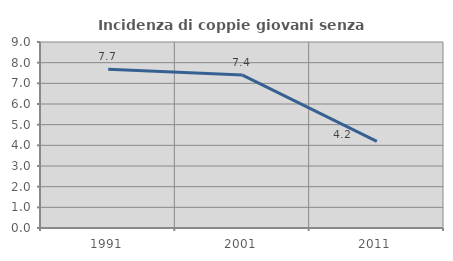
| Category | Incidenza di coppie giovani senza figli |
|---|---|
| 1991.0 | 7.678 |
| 2001.0 | 7.399 |
| 2011.0 | 4.193 |